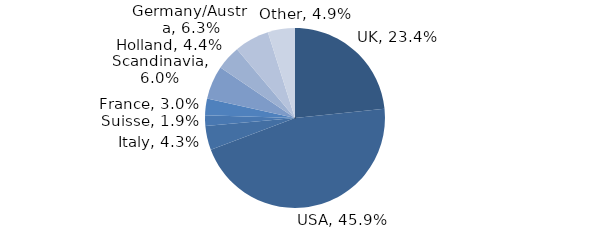
| Category | Investment Style |
|---|---|
| UK | 0.234 |
| USA | 0.459 |
| Italy | 0.043 |
| Suisse | 0.019 |
| France | 0.03 |
| Scandinavia | 0.06 |
| Holland | 0.044 |
| Germany/Austria | 0.063 |
| Other | 0.049 |